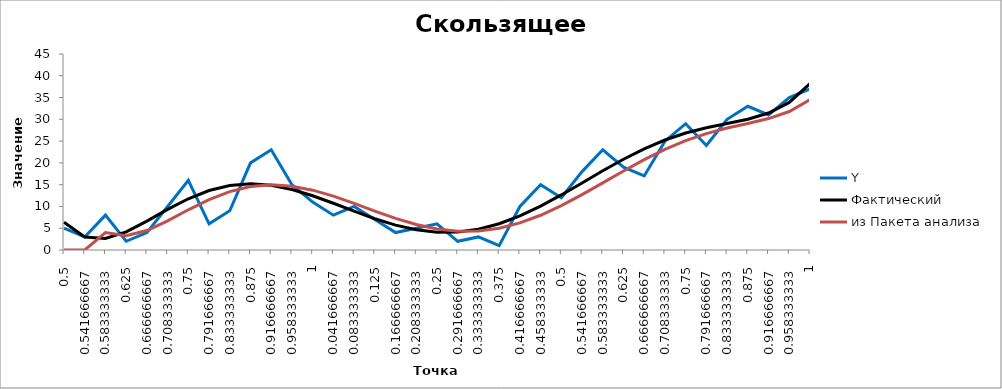
| Category | Y | Фактический | из Пакета анализа |
|---|---|---|---|
| 0.5 | 5 | 6.392 | 0 |
| 0.5416666666666666 | 3 | 2.97 | 0 |
| 0.5833333333333334 | 8 | 2.632 | 3.998 |
| 0.625 | 2 | 4.162 | 3.254 |
| 0.6666666666666666 | 4 | 6.621 | 4.472 |
| 0.7083333333333334 | 10 | 9.317 | 6.7 |
| 0.75 | 16 | 11.764 | 9.234 |
| 0.7916666666666666 | 6 | 13.651 | 11.578 |
| 0.8333333333333334 | 9 | 14.814 | 13.41 |
| 0.875 | 20 | 15.202 | 14.556 |
| 0.9166666666666666 | 23 | 14.859 | 14.958 |
| 0.9583333333333334 | 15 | 13.892 | 14.651 |
| 1.0 | 11 | 12.456 | 13.735 |
| 0.041666666666666664 | 8 | 10.733 | 12.36 |
| 0.08333333333333333 | 10 | 8.913 | 10.701 |
| 0.125 | 7 | 7.184 | 8.943 |
| 0.16666666666666666 | 4 | 5.715 | 7.271 |
| 0.20833333333333334 | 5 | 4.651 | 5.85 |
| 0.25 | 6 | 4.101 | 4.823 |
| 0.2916666666666667 | 2 | 4.136 | 4.296 |
| 0.3333333333333333 | 3 | 4.784 | 4.34 |
| 0.375 | 1 | 6.032 | 4.984 |
| 0.4166666666666667 | 10 | 7.824 | 6.213 |
| 0.4583333333333333 | 15 | 10.068 | 7.975 |
| 0.5 | 12 | 12.641 | 10.178 |
| 0.5416666666666666 | 18 | 15.398 | 12.702 |
| 0.5833333333333334 | 23 | 18.182 | 15.407 |
| 0.625 | 19 | 20.838 | 18.139 |
| 0.6666666666666666 | 17 | 23.229 | 20.75 |
| 0.7083333333333334 | 25 | 25.253 | 23.107 |
| 0.75 | 29 | 26.862 | 25.115 |
| 0.7916666666666666 | 24 | 28.085 | 26.733 |
| 0.8333333333333334 | 30 | 29.057 | 28.001 |
| 0.875 | 33 | 30.037 | 29.06 |
| 0.9166666666666666 | 31 | 31.445 | 30.179 |
| 0.9583333333333334 | 35 | 33.892 | 31.791 |
| 1.0 | 37 | 38.21 | 34.516 |